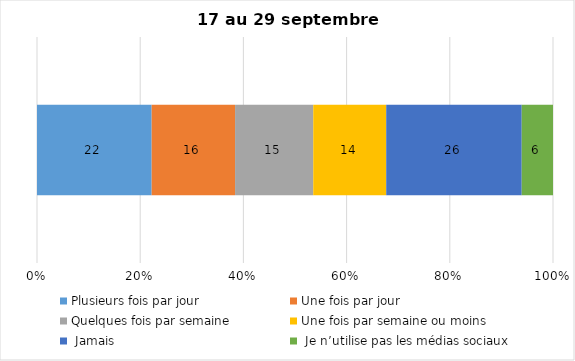
| Category | Plusieurs fois par jour | Une fois par jour | Quelques fois par semaine   | Une fois par semaine ou moins   |  Jamais   |  Je n’utilise pas les médias sociaux |
|---|---|---|---|---|---|---|
| 0 | 22 | 16 | 15 | 14 | 26 | 6 |